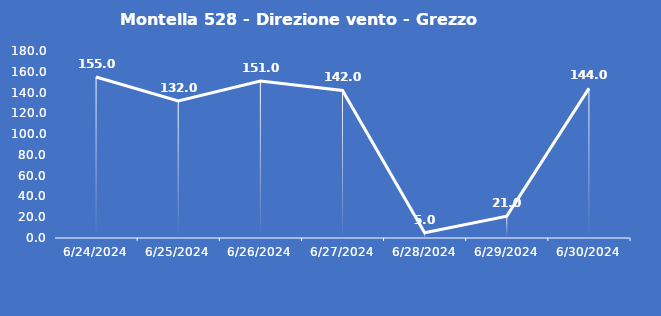
| Category | Montella 528 - Direzione vento - Grezzo (°N) |
|---|---|
| 6/24/24 | 155 |
| 6/25/24 | 132 |
| 6/26/24 | 151 |
| 6/27/24 | 142 |
| 6/28/24 | 5 |
| 6/29/24 | 21 |
| 6/30/24 | 144 |